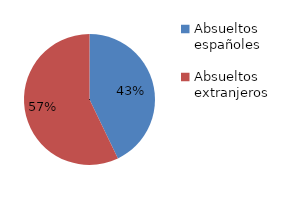
| Category | Series 0 |
|---|---|
| Absueltos españoles | 6 |
| Absueltos extranjeros | 8 |
| Absueltos Personas Jurídicas | 0 |